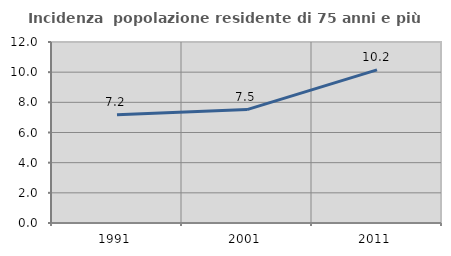
| Category | Incidenza  popolazione residente di 75 anni e più |
|---|---|
| 1991.0 | 7.173 |
| 2001.0 | 7.52 |
| 2011.0 | 10.152 |